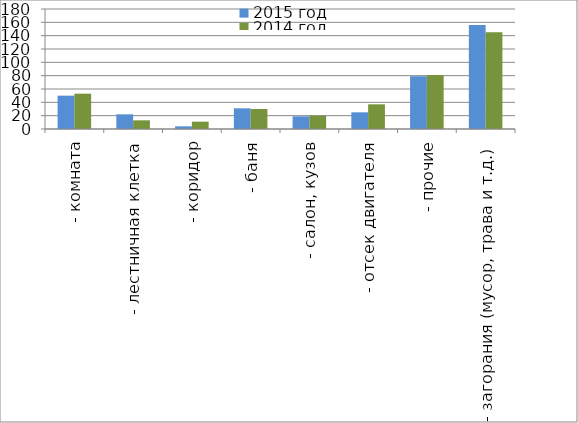
| Category | 2015 год | 2014 год |
|---|---|---|
|  - комната | 50 | 53 |
|  - лестничная клетка | 22 | 13 |
|  - коридор | 4 | 11 |
|  - баня | 31 | 30 |
|  - салон, кузов | 19 | 20 |
|  - отсек двигателя | 25 | 37 |
| - прочие | 79 | 81 |
| - загорания (мусор, трава и т.д.)  | 156 | 145 |